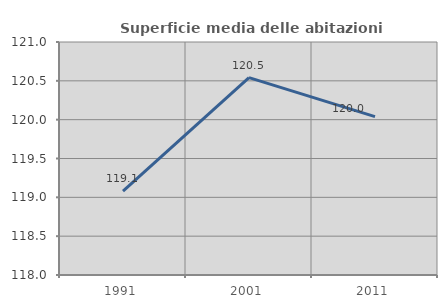
| Category | Superficie media delle abitazioni occupate |
|---|---|
| 1991.0 | 119.081 |
| 2001.0 | 120.542 |
| 2011.0 | 120.039 |